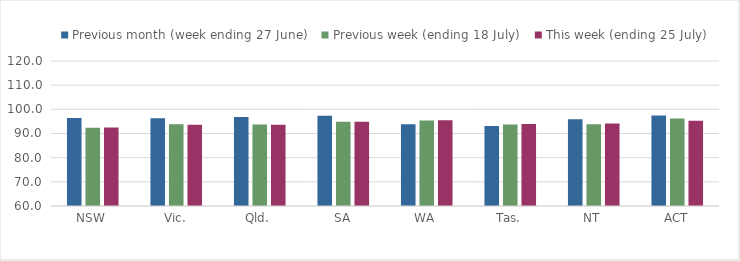
| Category | Previous month (week ending 27 June) | Previous week (ending 18 July) | This week (ending 25 July) |
|---|---|---|---|
| NSW | 96.465 | 92.377 | 92.469 |
| Vic. | 96.296 | 93.85 | 93.591 |
| Qld. | 96.815 | 93.775 | 93.665 |
| SA | 97.308 | 94.893 | 94.827 |
| WA | 93.819 | 95.385 | 95.489 |
| Tas. | 93.132 | 93.724 | 93.952 |
| NT | 95.897 | 93.846 | 94.094 |
| ACT | 97.466 | 96.217 | 95.286 |